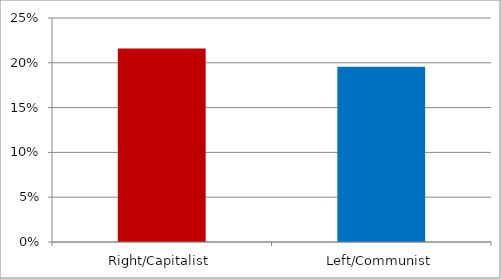
| Category | Non Election |
|---|---|
| Right/Capitalist | 0.216 |
| Left/Communist | 0.196 |